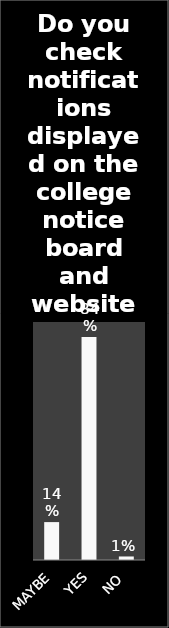
| Category | Series 0 |
|---|---|
| MAYBE | 0.143 |
| YES | 0.843 |
| NO | 0.013 |